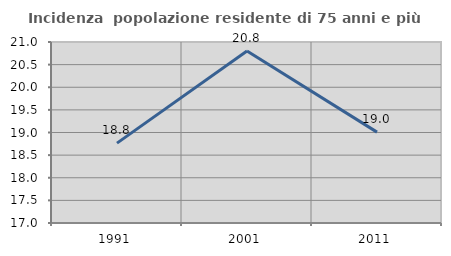
| Category | Incidenza  popolazione residente di 75 anni e più |
|---|---|
| 1991.0 | 18.765 |
| 2001.0 | 20.8 |
| 2011.0 | 19.008 |